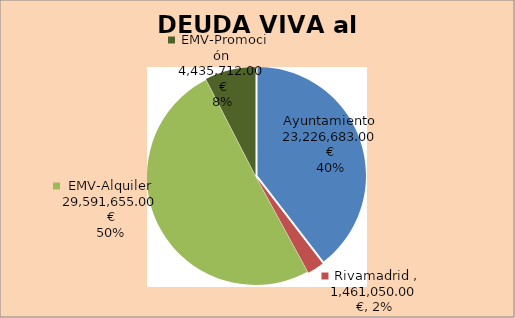
| Category | Series 0 |
|---|---|
| Ayuntamiento | 23226683 |
| Rivamadrid | 1461050 |
| EMV-Alquiler | 29591655 |
| EMV-Promoción | 4435712 |